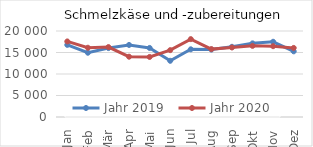
| Category | Jahr 2019 | Jahr 2020 |
|---|---|---|
| Jan | 16769.871 | 17573.193 |
| Feb | 14944.597 | 16106.99 |
| Mär | 16030.828 | 16264.398 |
| Apr | 16756.818 | 14023.861 |
| Mai | 16058.441 | 13966.211 |
| Jun | 13070.386 | 15547.855 |
| Jul | 15742.71 | 18110.021 |
| Aug | 15677.903 | 15788.175 |
| Sep | 16325.122 | 16167.396 |
| Okt | 17124.785 | 16542.725 |
| Nov | 17495.937 | 16469.132 |
| Dez | 15273.469 | 16063.076 |